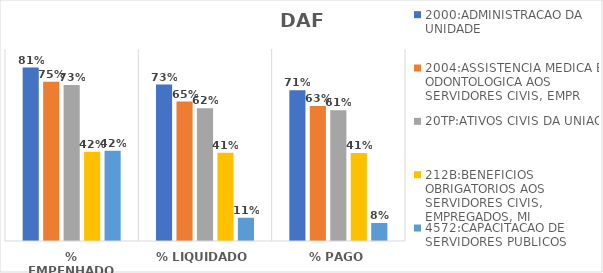
| Category | 2000:ADMINISTRACAO DA UNIDADE | 2004:ASSISTENCIA MEDICA E ODONTOLOGICA AOS SERVIDORES CIVIS, EMPR | 20TP:ATIVOS CIVIS DA UNIAO | 212B:BENEFICIOS OBRIGATORIOS AOS SERVIDORES CIVIS, EMPREGADOS, MI | 4572:CAPACITACAO DE SERVIDORES PUBLICOS FEDERAIS EM PROCESSO DE Q |
|---|---|---|---|---|---|
| % EMPENHADO | 0.813 | 0.746 | 0.731 | 0.418 | 0.423 |
| % LIQUIDADO | 0.733 | 0.653 | 0.622 | 0.413 | 0.109 |
| % PAGO | 0.706 | 0.632 | 0.613 | 0.413 | 0.084 |